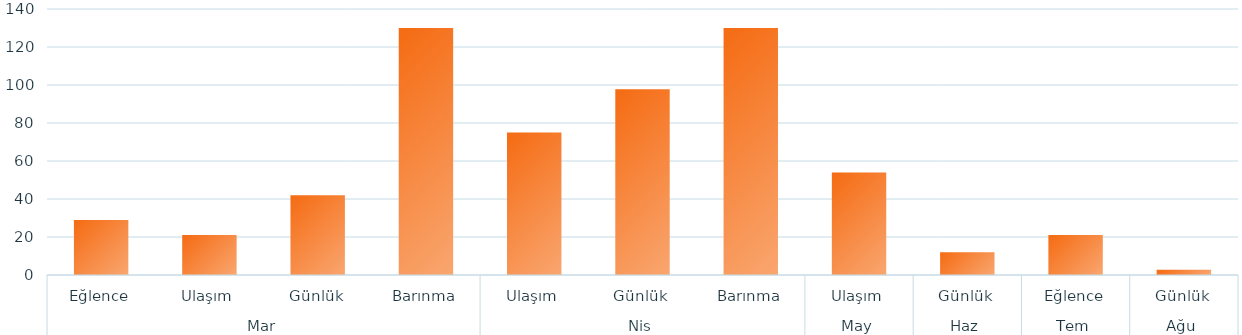
| Category | Toplam |
|---|---|
| 0 | 29 |
| 1 | 21 |
| 2 | 42 |
| 3 | 130 |
| 4 | 75 |
| 5 | 97.75 |
| 6 | 130 |
| 7 | 54 |
| 8 | 12 |
| 9 | 21 |
| 10 | 2.75 |